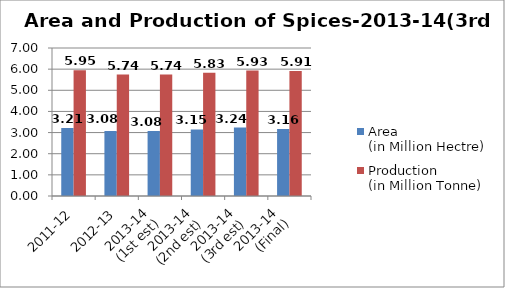
| Category | Area
(in Million Hectre) | Production
(in Million Tonne) |
|---|---|---|
| 2011-12 | 3.212 | 5.951 |
| 2012-13 | 3.076 | 5.744 |
| 2013-14
(1st est) | 3.076 | 5.744 |
| 2013-14
(2nd est) | 3.146 | 5.834 |
| 2013-14
(3rd est) | 3.235 | 5.931 |
| 2013-14
(Final) | 3.163 | 5.908 |